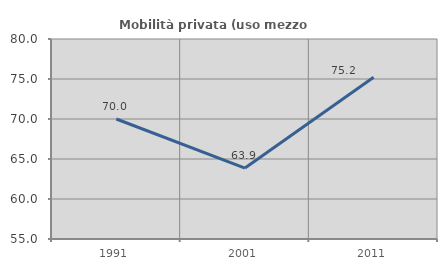
| Category | Mobilità privata (uso mezzo privato) |
|---|---|
| 1991.0 | 70 |
| 2001.0 | 63.866 |
| 2011.0 | 75.221 |